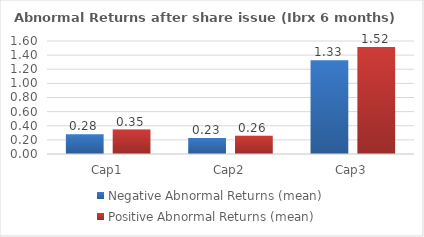
| Category | Negative Abnormal Returns (mean) | Positive Abnormal Returns (mean) |
|---|---|---|
| Cap1 | 0.279 | 0.345 |
| Cap2 | 0.227 | 0.259 |
| Cap3 | 1.327 | 1.516 |